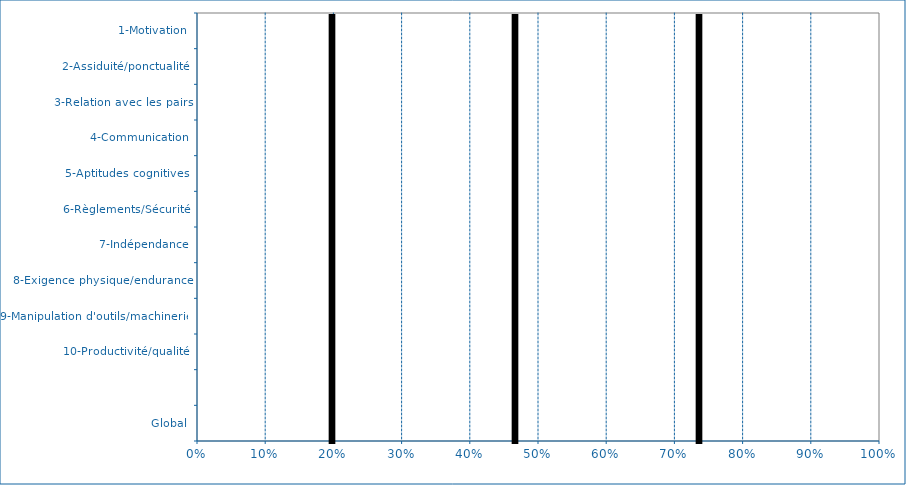
| Category | Series 0 |
|---|---|
| Global | 0 |
|  | 0 |
| 10-Productivité/qualité | 0 |
| 9-Manipulation d'outils/machinerie | 0 |
| 8-Exigence physique/endurance | 0 |
| 7-Indépendance | 0 |
| 6-Règlements/Sécurité | 0 |
| 5-Aptitudes cognitives | 0 |
| 4-Communication | 0 |
| 3-Relation avec les pairs | 0 |
| 2-Assiduité/ponctualité | 0 |
| 1-Motivation | 0 |